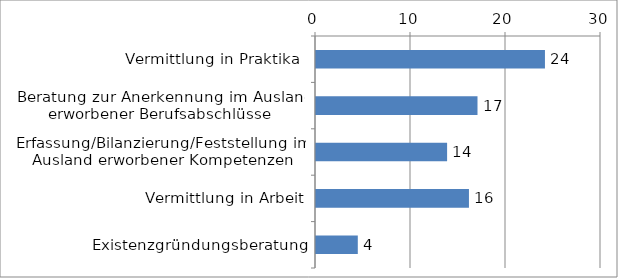
| Category | Series 0 |
|---|---|
| Vermittlung in Praktika  | 24.1 |
| Beratung zur Anerkennung im Ausland erworbener Berufsabschlüsse  | 17 |
| Erfassung/Bilanzierung/Feststellung im Ausland erworbener Kompetenzen | 13.8 |
| Vermittlung in Arbeit | 16.1 |
| Existenzgründungsberatung | 4.4 |